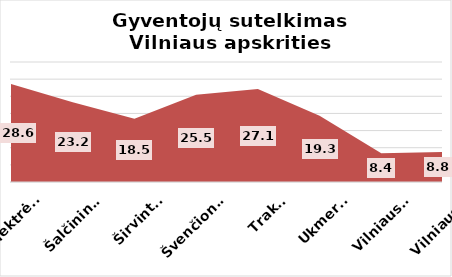
| Category | Series 0 |
|---|---|
| Elektrėnai | 28.61 |
| Šalčininkai | 23.24 |
| Širvintos | 18.45 |
| Švenčionys | 25.45 |
| Trakai | 27.1 |
| Ukmergė | 19.31 |
| Vilniaus r. | 8.4 |
| Vilniaus m. | 8.755 |